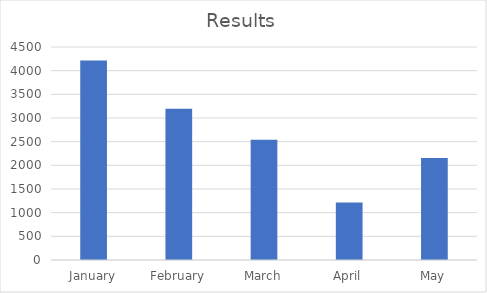
| Category | Results |
|---|---|
| January | 4213 |
| February | 3194 |
| March | 2541 |
| April | 1214 |
| May | 2154 |